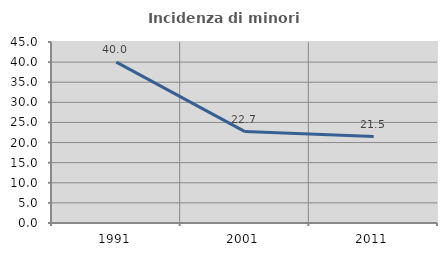
| Category | Incidenza di minori stranieri |
|---|---|
| 1991.0 | 40 |
| 2001.0 | 22.727 |
| 2011.0 | 21.484 |